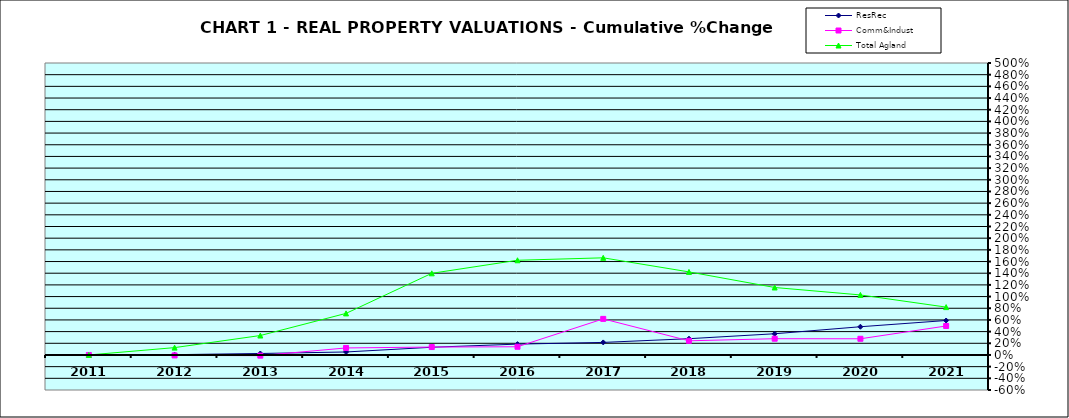
| Category | ResRec | Comm&Indust | Total Agland |
|---|---|---|---|
| 2011.0 | 0 | 0 | 0 |
| 2012.0 | 0.005 | -0.008 | 0.126 |
| 2013.0 | 0.025 | -0.012 | 0.333 |
| 2014.0 | 0.051 | 0.12 | 0.712 |
| 2015.0 | 0.132 | 0.135 | 1.398 |
| 2016.0 | 0.186 | 0.141 | 1.622 |
| 2017.0 | 0.215 | 0.618 | 1.664 |
| 2018.0 | 0.279 | 0.242 | 1.422 |
| 2019.0 | 0.363 | 0.278 | 1.155 |
| 2020.0 | 0.483 | 0.277 | 1.028 |
| 2021.0 | 0.59 | 0.496 | 0.819 |